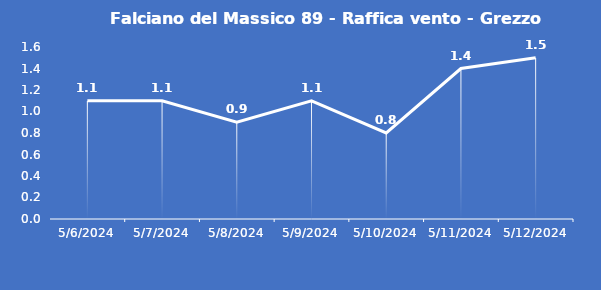
| Category | Falciano del Massico 89 - Raffica vento - Grezzo (m/s) |
|---|---|
| 5/6/24 | 1.1 |
| 5/7/24 | 1.1 |
| 5/8/24 | 0.9 |
| 5/9/24 | 1.1 |
| 5/10/24 | 0.8 |
| 5/11/24 | 1.4 |
| 5/12/24 | 1.5 |